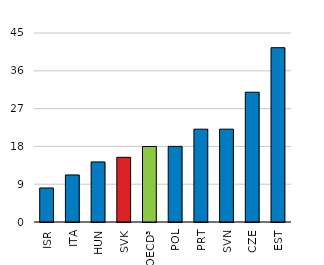
| Category | income  |
|---|---|
| ISR | 8.1 |
| ITA | 11.2 |
| HUN | 14.3 |
| SVK | 15.4 |
| OECD³ | 17.976 |
| POL | 18 |
| PRT | 22.1 |
| SVN | 22.1 |
| CZE | 30.9 |
| EST | 41.5 |